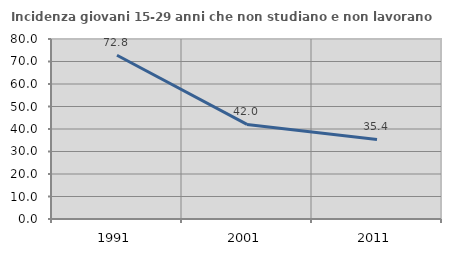
| Category | Incidenza giovani 15-29 anni che non studiano e non lavorano  |
|---|---|
| 1991.0 | 72.797 |
| 2001.0 | 42.029 |
| 2011.0 | 35.36 |